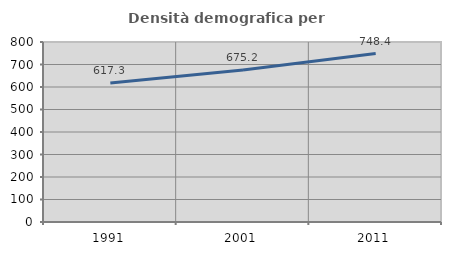
| Category | Densità demografica |
|---|---|
| 1991.0 | 617.332 |
| 2001.0 | 675.184 |
| 2011.0 | 748.42 |